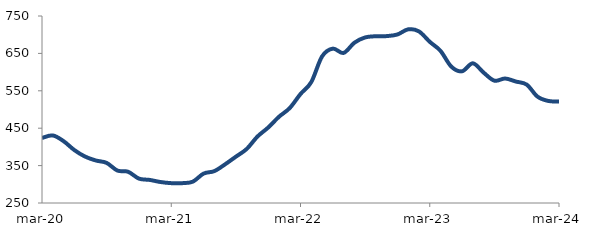
| Category | Series 0 |
|---|---|
| 2020-03-01 | 423.833 |
| 2020-04-01 | 430.658 |
| 2020-05-01 | 415.426 |
| 2020-06-01 | 391.575 |
| 2020-07-01 | 374.117 |
| 2020-08-01 | 363.638 |
| 2020-09-01 | 357.239 |
| 2020-10-01 | 336.734 |
| 2020-11-01 | 333.458 |
| 2020-12-01 | 315.173 |
| 2021-01-01 | 311.708 |
| 2021-02-01 | 306.103 |
| 2021-03-01 | 303.075 |
| 2021-04-01 | 303.034 |
| 2021-05-01 | 306.996 |
| 2021-06-01 | 328.614 |
| 2021-07-01 | 335.232 |
| 2021-08-01 | 353.414 |
| 2021-09-01 | 373.869 |
| 2021-10-01 | 394.393 |
| 2021-11-01 | 427.592 |
| 2021-12-01 | 451.83 |
| 2022-01-01 | 480.528 |
| 2022-02-01 | 503.882 |
| 2022-03-01 | 541.428 |
| 2022-04-01 | 573.261 |
| 2022-05-01 | 641.774 |
| 2022-06-01 | 662.728 |
| 2022-07-01 | 651.267 |
| 2022-08-01 | 678.506 |
| 2022-09-01 | 692.688 |
| 2022-10-01 | 695.873 |
| 2022-11-01 | 696.235 |
| 2022-12-01 | 700.598 |
| 2023-01-01 | 714.422 |
| 2023-02-01 | 708.75 |
| 2023-03-01 | 680.994 |
| 2023-04-01 | 656.708 |
| 2023-05-01 | 614.698 |
| 2023-06-01 | 602.139 |
| 2023-07-01 | 623.52 |
| 2023-08-01 | 598.686 |
| 2023-09-01 | 577.1 |
| 2023-10-01 | 582.836 |
| 2023-11-01 | 574.767 |
| 2023-12-01 | 566.559 |
| 2024-01-01 | 534.515 |
| 2024-02-01 | 522.877 |
| 2024-03-01 | 521.351 |